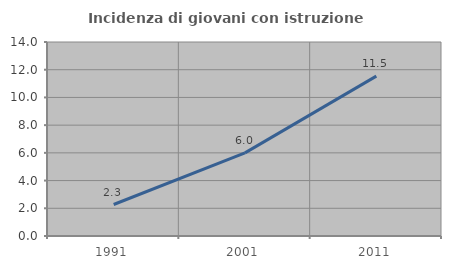
| Category | Incidenza di giovani con istruzione universitaria |
|---|---|
| 1991.0 | 2.273 |
| 2001.0 | 6 |
| 2011.0 | 11.538 |